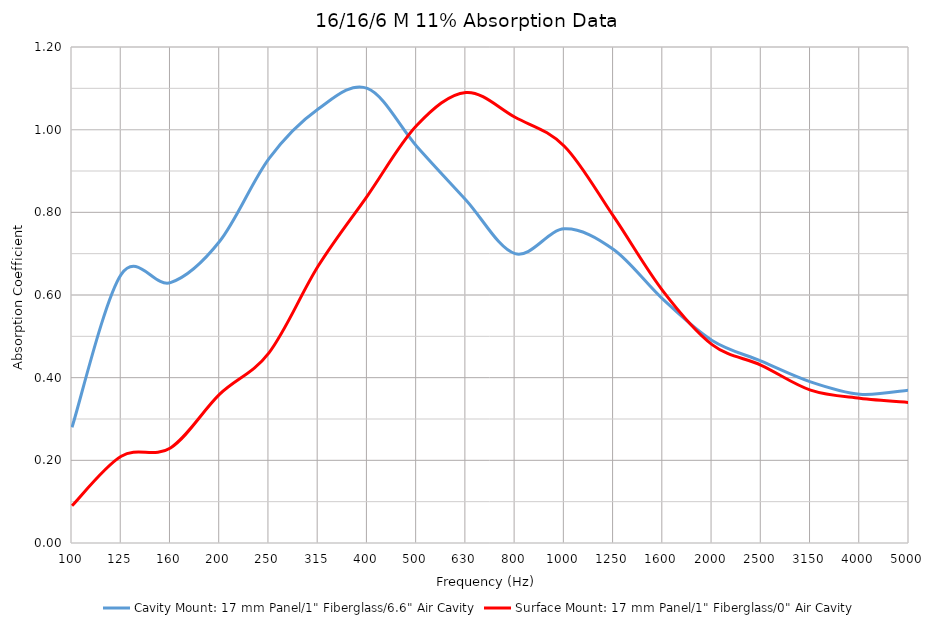
| Category | Cavity Mount: 17 mm Panel/1" Fiberglass/6.6" Air Cavity | Surface Mount: 17 mm Panel/1" Fiberglass/0" Air Cavity |
|---|---|---|
| 100.0 | 0.28 | 0.09 |
| 125.0 | 0.65 | 0.21 |
| 160.0 | 0.63 | 0.23 |
| 200.0 | 0.73 | 0.36 |
| 250.0 | 0.93 | 0.46 |
| 315.0 | 1.05 | 0.67 |
| 400.0 | 1.1 | 0.84 |
| 500.0 | 0.96 | 1.01 |
| 630.0 | 0.83 | 1.09 |
| 800.0 | 0.7 | 1.03 |
| 1000.0 | 0.76 | 0.96 |
| 1250.0 | 0.71 | 0.79 |
| 1600.0 | 0.59 | 0.61 |
| 2000.0 | 0.49 | 0.48 |
| 2500.0 | 0.44 | 0.43 |
| 3150.0 | 0.39 | 0.37 |
| 4000.0 | 0.36 | 0.35 |
| 5000.0 | 0.37 | 0.34 |